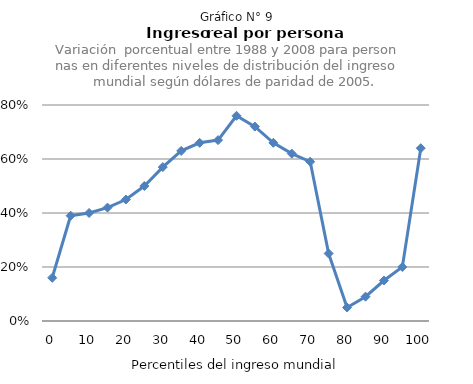
| Category | Ingreso real por persona |
|---|---|
| 0.0 | 0.16 |
| 5.0 | 0.39 |
| 10.0 | 0.4 |
| 15.0 | 0.42 |
| 20.0 | 0.45 |
| 25.0 | 0.5 |
| 30.0 | 0.57 |
| 35.0 | 0.63 |
| 40.0 | 0.66 |
| 45.0 | 0.67 |
| 50.0 | 0.76 |
| 55.0 | 0.72 |
| 60.0 | 0.66 |
| 65.0 | 0.62 |
| 70.0 | 0.59 |
| 75.0 | 0.25 |
| 80.0 | 0.05 |
| 85.0 | 0.09 |
| 90.0 | 0.15 |
| 95.0 | 0.2 |
| 100.0 | 0.64 |